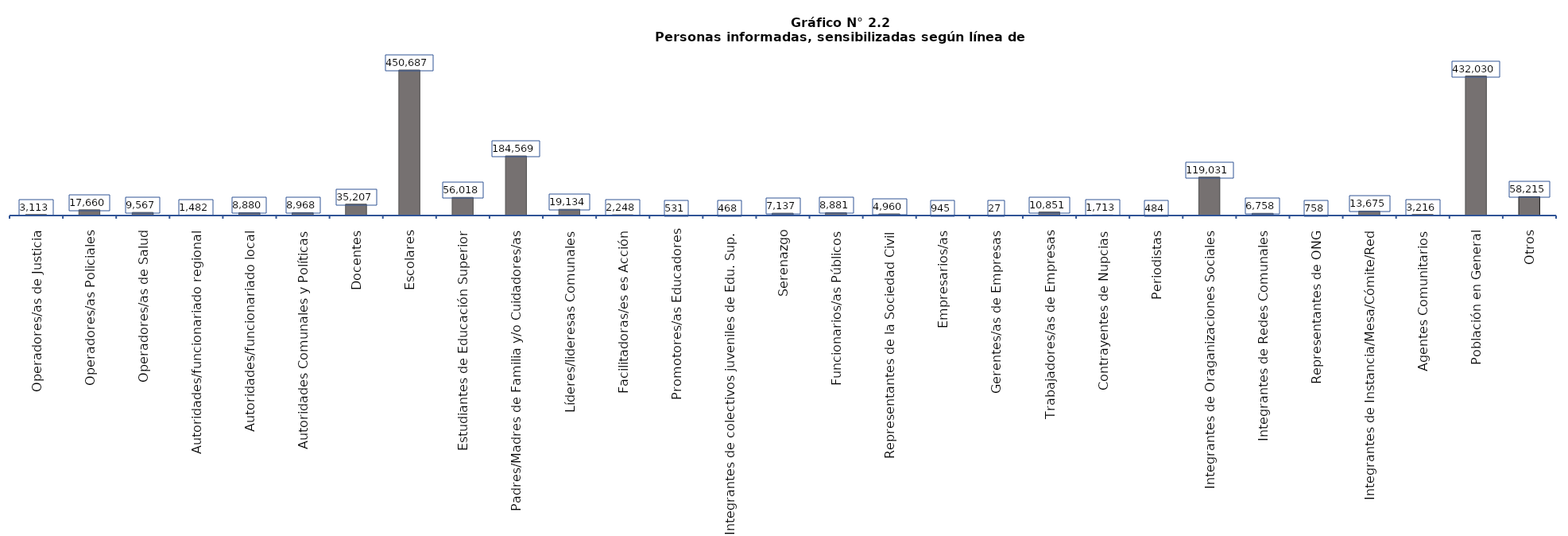
| Category | Series 0 |
|---|---|
| Operadores/as de Justicia | 3113 |
| Operadores/as Policiales | 17660 |
| Operadores/as de Salud | 9567 |
| Autoridades/funcionariado regional | 1482 |
| Autoridades/funcionariado local | 8880 |
| Autoridades Comunales y Políticas | 8968 |
| Docentes | 35207 |
| Escolares | 450687 |
| Estudiantes de Educación Superior | 56018 |
| Padres/Madres de Familia y/o Cuidadores/as | 184569 |
| Líderes/lideresas Comunales | 19134 |
| Facilitadoras/es es Acción | 2248 |
| Promotores/as Educadores | 531 |
| Integrantes de colectivos juveniles de Edu. Sup. | 468 |
| Serenazgo | 7137 |
| Funcionarios/as Públicos | 8881 |
| Representantes de la Sociedad Civil | 4960 |
| Empresarios/as | 945 |
| Gerentes/as de Empresas | 27 |
| Trabajadores/as de Empresas | 10851 |
| Contrayentes de Nupcias | 1713 |
| Periodistas | 484 |
| Integrantes de Oraganizaciones Sociales | 119031 |
| Integrantes de Redes Comunales | 6758 |
| Representantes de ONG | 758 |
| Integrantes de Instancia/Mesa/Cómite/Red | 13675 |
| Agentes Comunitarios | 3216 |
| Población en General | 432030 |
| Otros | 58215 |